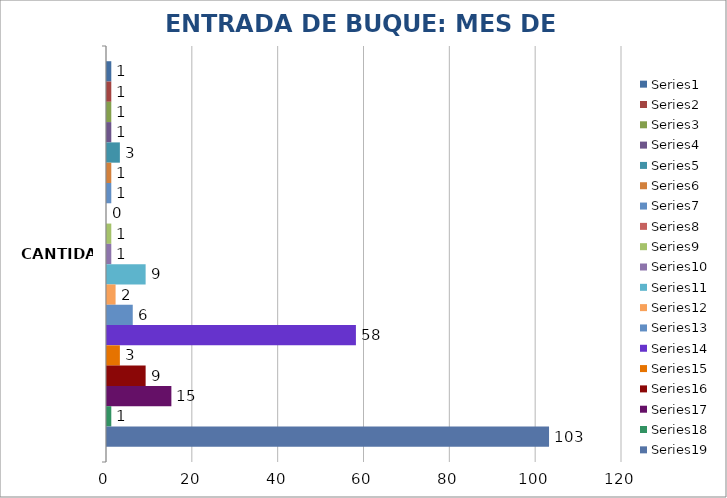
| Category | Series 0 | Series 1 | Series 2 | Series 3 | Series 4 | Series 5 | Series 6 | Series 7 | Series 8 | Series 9 | Series 10 | Series 11 | Series 12 | Series 13 | Series 14 | Series 15 | Series 16 | Series 17 | Series 18 |
|---|---|---|---|---|---|---|---|---|---|---|---|---|---|---|---|---|---|---|---|
| CANTIDAD | 1 | 1 | 1 | 1 | 3 | 1 | 1 | 0 | 1 | 1 | 9 | 2 | 6 | 58 | 3 | 9 | 15 | 1 | 103 |